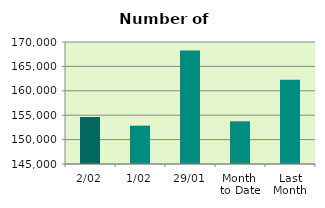
| Category | Series 0 |
|---|---|
| 2/02 | 154632 |
| 1/02 | 152858 |
| 29/01 | 168254 |
| Month 
to Date | 153745 |
| Last
Month | 162275.9 |